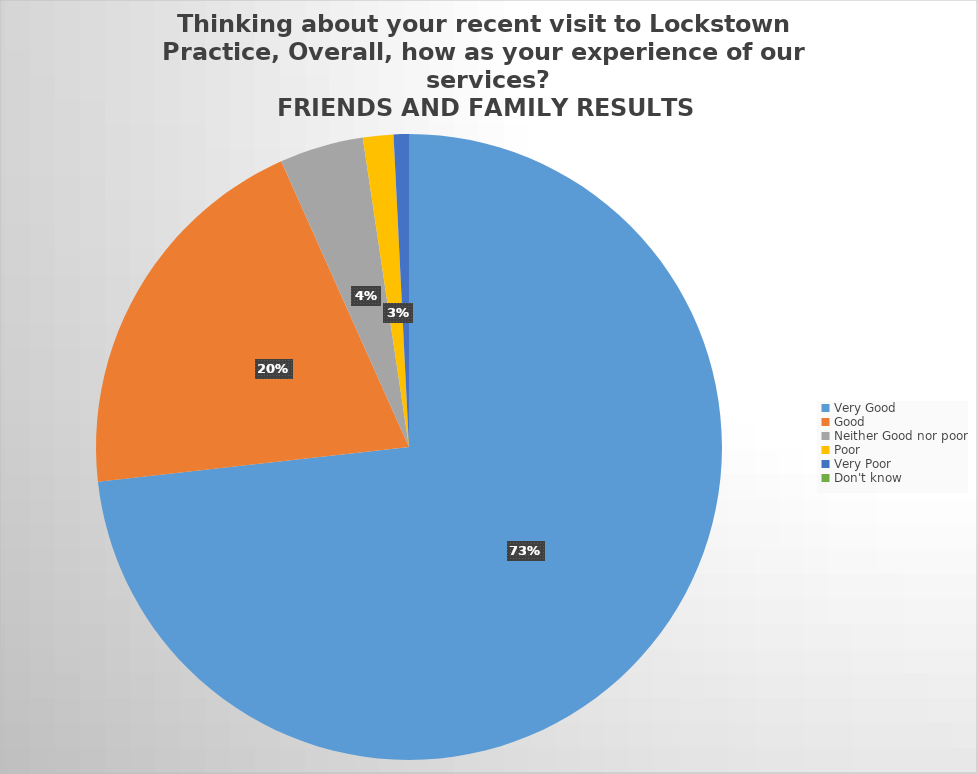
| Category | Responses |
|---|---|
| Very Good | 186 |
| Good | 51 |
| Neither Good nor poor | 11 |
| Poor | 4 |
| Very Poor | 2 |
| Don't know  | 0 |